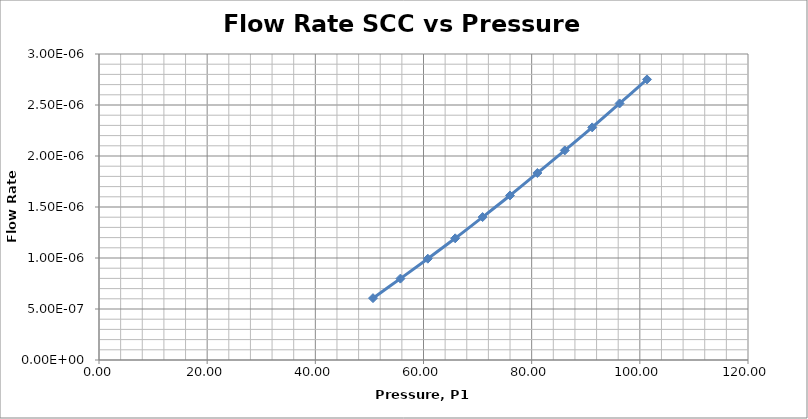
| Category | Series 0 |
|---|---|
| 50.6625 | 0 |
| 55.72875 | 0 |
| 60.795 | 0 |
| 65.86125 | 0 |
| 70.9275 | 0 |
| 75.99375 | 0 |
| 81.06 | 0 |
| 86.12625 | 0 |
| 91.1925 | 0 |
| 96.25875 | 0 |
| 101.325 | 0 |